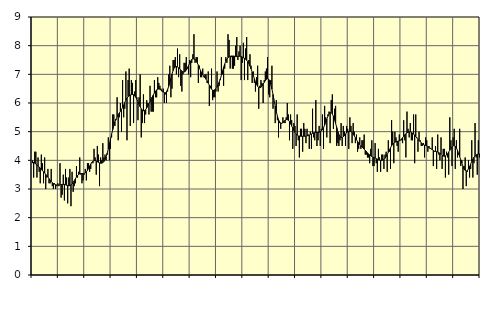
| Category | Piggar | Series 1 |
|---|---|---|
| nan | 4 | 3.91 |
| 87.0 | 3.4 | 3.93 |
| 87.0 | 4.3 | 3.9 |
| 87.0 | 4.3 | 3.87 |
| 87.0 | 3.4 | 3.84 |
| 87.0 | 4.1 | 3.8 |
| 87.0 | 3.6 | 3.77 |
| 87.0 | 3.2 | 3.73 |
| 87.0 | 4.2 | 3.68 |
| 87.0 | 3.9 | 3.64 |
| 87.0 | 3.2 | 3.6 |
| 87.0 | 4.1 | 3.56 |
| nan | 3 | 3.51 |
| 88.0 | 3.4 | 3.47 |
| 88.0 | 3.7 | 3.42 |
| 88.0 | 3.2 | 3.36 |
| 88.0 | 3.2 | 3.31 |
| 88.0 | 3.7 | 3.26 |
| 88.0 | 3.1 | 3.22 |
| 88.0 | 3 | 3.19 |
| 88.0 | 3.2 | 3.17 |
| 88.0 | 3 | 3.15 |
| 88.0 | 3.1 | 3.14 |
| 88.0 | 3.2 | 3.14 |
| nan | 3.1 | 3.14 |
| 89.0 | 3.9 | 3.15 |
| 89.0 | 2.7 | 3.15 |
| 89.0 | 2.8 | 3.16 |
| 89.0 | 3.5 | 3.16 |
| 89.0 | 2.6 | 3.16 |
| 89.0 | 3.7 | 3.15 |
| 89.0 | 3.4 | 3.13 |
| 89.0 | 2.5 | 3.12 |
| 89.0 | 3.4 | 3.11 |
| 89.0 | 3.7 | 3.12 |
| 89.0 | 2.4 | 3.14 |
| nan | 3.6 | 3.18 |
| 90.0 | 2.9 | 3.23 |
| 90.0 | 3.1 | 3.29 |
| 90.0 | 3.2 | 3.35 |
| 90.0 | 3.8 | 3.42 |
| 90.0 | 3.4 | 3.47 |
| 90.0 | 3.6 | 3.51 |
| 90.0 | 4.1 | 3.53 |
| 90.0 | 3.5 | 3.54 |
| 90.0 | 3.2 | 3.54 |
| 90.0 | 3.3 | 3.54 |
| 90.0 | 3.5 | 3.54 |
| nan | 3.7 | 3.56 |
| 91.0 | 3.3 | 3.6 |
| 91.0 | 3.9 | 3.65 |
| 91.0 | 3.9 | 3.72 |
| 91.0 | 3.6 | 3.8 |
| 91.0 | 3.7 | 3.87 |
| 91.0 | 3.9 | 3.93 |
| 91.0 | 3.9 | 3.97 |
| 91.0 | 4.4 | 3.99 |
| 91.0 | 4.1 | 3.99 |
| 91.0 | 3.5 | 3.97 |
| 91.0 | 4.5 | 3.95 |
| nan | 4.2 | 3.93 |
| 92.0 | 3.1 | 3.91 |
| 92.0 | 4.1 | 3.9 |
| 92.0 | 4 | 3.9 |
| 92.0 | 4.6 | 3.92 |
| 92.0 | 4.1 | 3.96 |
| 92.0 | 4.2 | 4.03 |
| 92.0 | 4 | 4.12 |
| 92.0 | 4.2 | 4.25 |
| 92.0 | 4.8 | 4.4 |
| 92.0 | 4 | 4.57 |
| 92.0 | 4.4 | 4.74 |
| nan | 4.8 | 4.91 |
| 93.0 | 5.6 | 5.07 |
| 93.0 | 5.6 | 5.21 |
| 93.0 | 5.2 | 5.34 |
| 93.0 | 5.4 | 5.44 |
| 93.0 | 6.2 | 5.52 |
| 93.0 | 4.7 | 5.59 |
| 93.0 | 5.5 | 5.65 |
| 93.0 | 6 | 5.71 |
| 93.0 | 5 | 5.77 |
| 93.0 | 6.8 | 5.85 |
| 93.0 | 5.5 | 5.93 |
| nan | 5.8 | 6.02 |
| 94.0 | 7.1 | 6.1 |
| 94.0 | 4.7 | 6.17 |
| 94.0 | 6.8 | 6.22 |
| 94.0 | 7.2 | 6.25 |
| 94.0 | 5.2 | 6.28 |
| 94.0 | 6.8 | 6.29 |
| 94.0 | 6.7 | 6.3 |
| 94.0 | 5.3 | 6.29 |
| 94.0 | 6.4 | 6.25 |
| 94.0 | 6.8 | 6.2 |
| 94.0 | 6.2 | 6.13 |
| nan | 5.4 | 6.05 |
| 95.0 | 6.2 | 5.96 |
| 95.0 | 7 | 5.87 |
| 95.0 | 4.8 | 5.8 |
| 95.0 | 5.3 | 5.75 |
| 95.0 | 6.3 | 5.73 |
| 95.0 | 5.3 | 5.74 |
| 95.0 | 5.6 | 5.77 |
| 95.0 | 6.1 | 5.83 |
| 95.0 | 6 | 5.9 |
| 95.0 | 5.6 | 5.98 |
| 95.0 | 6.6 | 6.05 |
| nan | 5.7 | 6.13 |
| 96.0 | 5.7 | 6.21 |
| 96.0 | 5.7 | 6.28 |
| 96.0 | 6.8 | 6.35 |
| 96.0 | 6.2 | 6.41 |
| 96.0 | 6.2 | 6.46 |
| 96.0 | 6.9 | 6.48 |
| 96.0 | 6.7 | 6.49 |
| 96.0 | 6.6 | 6.48 |
| 96.0 | 6.5 | 6.45 |
| 96.0 | 6.4 | 6.42 |
| 96.0 | 6.5 | 6.38 |
| nan | 6 | 6.36 |
| 97.0 | 6.3 | 6.36 |
| 97.0 | 6 | 6.4 |
| 97.0 | 6.4 | 6.47 |
| 97.0 | 7 | 6.58 |
| 97.0 | 7.3 | 6.71 |
| 97.0 | 6.2 | 6.86 |
| 97.0 | 6.5 | 7.01 |
| 97.0 | 7.5 | 7.13 |
| 97.0 | 7.5 | 7.22 |
| 97.0 | 7.6 | 7.26 |
| 97.0 | 7 | 7.27 |
| nan | 7.9 | 7.26 |
| 98.0 | 6.9 | 7.23 |
| 98.0 | 7.7 | 7.19 |
| 98.0 | 6.6 | 7.15 |
| 98.0 | 6.4 | 7.11 |
| 98.0 | 7 | 7.08 |
| 98.0 | 7.4 | 7.08 |
| 98.0 | 7.4 | 7.1 |
| 98.0 | 7.6 | 7.15 |
| 98.0 | 7.2 | 7.22 |
| 98.0 | 7 | 7.3 |
| 98.0 | 7.5 | 7.39 |
| nan | 6.9 | 7.46 |
| 99.0 | 7.4 | 7.52 |
| 99.0 | 7.7 | 7.54 |
| 99.0 | 8.4 | 7.54 |
| 99.0 | 7.4 | 7.52 |
| 99.0 | 7.6 | 7.47 |
| 99.0 | 7.6 | 7.4 |
| 99.0 | 6.7 | 7.32 |
| 99.0 | 7.3 | 7.22 |
| 99.0 | 6.9 | 7.13 |
| 99.0 | 6.9 | 7.05 |
| 99.0 | 7.2 | 6.99 |
| nan | 6.9 | 6.93 |
| 0.0 | 7 | 6.88 |
| 0.0 | 7 | 6.83 |
| 0.0 | 6.7 | 6.77 |
| 0.0 | 7.1 | 6.69 |
| 0.0 | 5.9 | 6.62 |
| 0.0 | 6.6 | 6.54 |
| 0.0 | 7.2 | 6.48 |
| 0.0 | 6.1 | 6.45 |
| 0.0 | 6.2 | 6.44 |
| 0.0 | 6.2 | 6.46 |
| 0.0 | 6.4 | 6.5 |
| nan | 7.1 | 6.56 |
| 1.0 | 6.4 | 6.64 |
| 1.0 | 6.6 | 6.73 |
| 1.0 | 6.8 | 6.84 |
| 1.0 | 7.6 | 6.97 |
| 1.0 | 7 | 7.11 |
| 1.0 | 6.6 | 7.24 |
| 1.0 | 7.2 | 7.36 |
| 1.0 | 7.6 | 7.46 |
| 1.0 | 7.4 | 7.53 |
| 1.0 | 8.4 | 7.58 |
| 1.0 | 8.2 | 7.61 |
| nan | 7.2 | 7.63 |
| 2.0 | 7.6 | 7.64 |
| 2.0 | 7.2 | 7.64 |
| 2.0 | 7.2 | 7.64 |
| 2.0 | 7.3 | 7.63 |
| 2.0 | 8 | 7.62 |
| 2.0 | 8.3 | 7.62 |
| 2.0 | 7.5 | 7.63 |
| 2.0 | 7.8 | 7.63 |
| 2.0 | 8 | 7.63 |
| 2.0 | 6.8 | 7.62 |
| 2.0 | 7.4 | 7.6 |
| nan | 8.1 | 7.58 |
| 3.0 | 6.8 | 7.56 |
| 3.0 | 7.9 | 7.53 |
| 3.0 | 8.3 | 7.49 |
| 3.0 | 6.8 | 7.45 |
| 3.0 | 7.5 | 7.38 |
| 3.0 | 7.7 | 7.29 |
| 3.0 | 7.3 | 7.19 |
| 3.0 | 6.7 | 7.08 |
| 3.0 | 7.1 | 6.96 |
| 3.0 | 6.7 | 6.85 |
| 3.0 | 6.4 | 6.74 |
| nan | 6.9 | 6.65 |
| 4.0 | 7.3 | 6.58 |
| 4.0 | 5.8 | 6.54 |
| 4.0 | 6.6 | 6.53 |
| 4.0 | 6.8 | 6.55 |
| 4.0 | 6.7 | 6.6 |
| 4.0 | 6 | 6.66 |
| 4.0 | 6.8 | 6.72 |
| 4.0 | 7.1 | 6.78 |
| 4.0 | 7.2 | 6.83 |
| 4.0 | 7.6 | 6.85 |
| 4.0 | 6.3 | 6.83 |
| nan | 6.2 | 6.77 |
| 5.0 | 6.8 | 6.65 |
| 5.0 | 7.3 | 6.49 |
| 5.0 | 5.8 | 6.3 |
| 5.0 | 6.1 | 6.1 |
| 5.0 | 5.3 | 5.89 |
| 5.0 | 6.1 | 5.7 |
| 5.0 | 5.4 | 5.54 |
| 5.0 | 4.8 | 5.42 |
| 5.0 | 5.3 | 5.34 |
| 5.0 | 5.1 | 5.3 |
| 5.0 | 5.3 | 5.29 |
| nan | 5.5 | 5.32 |
| 6.0 | 5.3 | 5.36 |
| 6.0 | 5.3 | 5.4 |
| 6.0 | 5.5 | 5.42 |
| 6.0 | 6 | 5.42 |
| 6.0 | 5.6 | 5.4 |
| 6.0 | 4.7 | 5.35 |
| 6.0 | 5.6 | 5.28 |
| 6.0 | 5.4 | 5.2 |
| 6.0 | 4.4 | 5.12 |
| 6.0 | 5.3 | 5.04 |
| 6.0 | 5.2 | 4.97 |
| nan | 4.5 | 4.92 |
| 7.0 | 5.6 | 4.88 |
| 7.0 | 4.7 | 4.85 |
| 7.0 | 4.1 | 4.85 |
| 7.0 | 5.1 | 4.84 |
| 7.0 | 5.1 | 4.84 |
| 7.0 | 4.3 | 4.84 |
| 7.0 | 5.3 | 4.84 |
| 7.0 | 5.1 | 4.84 |
| 7.0 | 4.6 | 4.84 |
| 7.0 | 5.1 | 4.85 |
| 7.0 | 4.9 | 4.87 |
| nan | 4.4 | 4.88 |
| 8.0 | 5 | 4.9 |
| 8.0 | 4.4 | 4.92 |
| 8.0 | 5.8 | 4.94 |
| 8.0 | 4.8 | 4.96 |
| 8.0 | 4.7 | 4.97 |
| 8.0 | 6.1 | 4.97 |
| 8.0 | 4.5 | 4.97 |
| 8.0 | 4.7 | 4.98 |
| 8.0 | 5.2 | 4.98 |
| 8.0 | 4.5 | 5 |
| 8.0 | 5.1 | 5.02 |
| nan | 5.6 | 5.07 |
| 9.0 | 4.4 | 5.14 |
| 9.0 | 5.9 | 5.23 |
| 9.0 | 5.5 | 5.33 |
| 9.0 | 4.8 | 5.44 |
| 9.0 | 5.6 | 5.54 |
| 9.0 | 5.7 | 5.62 |
| 9.0 | 4.6 | 5.67 |
| 9.0 | 6.1 | 5.67 |
| 9.0 | 6.3 | 5.62 |
| 9.0 | 5.1 | 5.54 |
| 9.0 | 5.8 | 5.42 |
| nan | 5.9 | 5.29 |
| 10.0 | 4.5 | 5.15 |
| 10.0 | 4.6 | 5.01 |
| 10.0 | 4.5 | 4.9 |
| 10.0 | 4.7 | 4.83 |
| 10.0 | 5.3 | 4.79 |
| 10.0 | 4.5 | 4.79 |
| 10.0 | 5.2 | 4.82 |
| 10.0 | 5 | 4.86 |
| 10.0 | 4.5 | 4.92 |
| 10.0 | 5.2 | 4.96 |
| 10.0 | 5.1 | 5 |
| nan | 4.4 | 5.01 |
| 11.0 | 5.5 | 5.01 |
| 11.0 | 5.2 | 5 |
| 11.0 | 4.6 | 4.97 |
| 11.0 | 5.3 | 4.92 |
| 11.0 | 5 | 4.86 |
| 11.0 | 4.6 | 4.79 |
| 11.0 | 4.9 | 4.72 |
| 11.0 | 4.3 | 4.66 |
| 11.0 | 4.4 | 4.61 |
| 11.0 | 4.8 | 4.55 |
| 11.0 | 4.4 | 4.51 |
| nan | 4.7 | 4.47 |
| 12.0 | 4.7 | 4.43 |
| 12.0 | 4.9 | 4.39 |
| 12.0 | 4.2 | 4.35 |
| 12.0 | 4.2 | 4.31 |
| 12.0 | 4.1 | 4.26 |
| 12.0 | 4.1 | 4.22 |
| 12.0 | 3.9 | 4.19 |
| 12.0 | 4.4 | 4.16 |
| 12.0 | 4.7 | 4.13 |
| 12.0 | 3.8 | 4.11 |
| 12.0 | 3.8 | 4.09 |
| nan | 4.6 | 4.08 |
| 13.0 | 3.9 | 4.06 |
| 13.0 | 3.6 | 4.04 |
| 13.0 | 4.4 | 4.02 |
| 13.0 | 4.1 | 4.01 |
| 13.0 | 3.6 | 4 |
| 13.0 | 4.2 | 4 |
| 13.0 | 4.2 | 4.01 |
| 13.0 | 3.7 | 4.04 |
| 13.0 | 4.2 | 4.07 |
| 13.0 | 4.3 | 4.13 |
| 13.0 | 3.6 | 4.2 |
| nan | 4.7 | 4.28 |
| 14.0 | 4.3 | 4.36 |
| 14.0 | 3.7 | 4.44 |
| 14.0 | 5.4 | 4.51 |
| 14.0 | 5 | 4.56 |
| 14.0 | 3.9 | 4.6 |
| 14.0 | 5 | 4.63 |
| 14.0 | 4.8 | 4.65 |
| 14.0 | 4.5 | 4.66 |
| 14.0 | 4.3 | 4.67 |
| 14.0 | 4.9 | 4.68 |
| 14.0 | 4.7 | 4.71 |
| nan | 4.7 | 4.74 |
| 15.0 | 4.6 | 4.79 |
| 15.0 | 5.4 | 4.84 |
| 15.0 | 4.7 | 4.89 |
| 15.0 | 4.1 | 4.93 |
| 15.0 | 5.7 | 4.96 |
| 15.0 | 5.1 | 4.98 |
| 15.0 | 4.8 | 4.99 |
| 15.0 | 5.3 | 4.99 |
| 15.0 | 4.7 | 4.97 |
| 15.0 | 4.7 | 4.95 |
| 15.0 | 5.6 | 4.92 |
| nan | 3.9 | 4.88 |
| 16.0 | 5.6 | 4.83 |
| 16.0 | 4.8 | 4.78 |
| 16.0 | 4.3 | 4.73 |
| 16.0 | 5 | 4.69 |
| 16.0 | 4.7 | 4.65 |
| 16.0 | 4.5 | 4.61 |
| 16.0 | 4.5 | 4.58 |
| 16.0 | 4.6 | 4.55 |
| 16.0 | 4.1 | 4.53 |
| 16.0 | 4.8 | 4.52 |
| 16.0 | 4.7 | 4.5 |
| nan | 4.3 | 4.48 |
| 17.0 | 4.5 | 4.45 |
| 17.0 | 4.4 | 4.43 |
| 17.0 | 4.4 | 4.4 |
| 17.0 | 4.8 | 4.37 |
| 17.0 | 3.8 | 4.34 |
| 17.0 | 4.3 | 4.32 |
| 17.0 | 4.5 | 4.31 |
| 17.0 | 3.7 | 4.3 |
| 17.0 | 4.9 | 4.29 |
| 17.0 | 4.2 | 4.27 |
| 17.0 | 4 | 4.24 |
| nan | 4.8 | 4.21 |
| 18.0 | 3.7 | 4.17 |
| 18.0 | 4.4 | 4.15 |
| 18.0 | 4.4 | 4.14 |
| 18.0 | 3.4 | 4.15 |
| 18.0 | 4.3 | 4.19 |
| 18.0 | 4.1 | 4.23 |
| 18.0 | 3.5 | 4.29 |
| 18.0 | 5.5 | 4.35 |
| 18.0 | 4.7 | 4.42 |
| 18.0 | 3.8 | 4.47 |
| 18.0 | 4.8 | 4.51 |
| nan | 5.1 | 4.51 |
| 19.0 | 3.7 | 4.49 |
| 19.0 | 4.7 | 4.43 |
| 19.0 | 4.1 | 4.35 |
| 19.0 | 4.2 | 4.24 |
| 19.0 | 5.1 | 4.13 |
| 19.0 | 3.8 | 4.01 |
| 19.0 | 4 | 3.9 |
| 19.0 | 3 | 3.79 |
| 19.0 | 3.8 | 3.7 |
| 19.0 | 4.1 | 3.65 |
| 19.0 | 3.1 | 3.63 |
| nan | 3.6 | 3.64 |
| 20.0 | 4 | 3.7 |
| 20.0 | 3.4 | 3.78 |
| 20.0 | 3.7 | 3.87 |
| 20.0 | 4.7 | 3.96 |
| 20.0 | 3.4 | 4.04 |
| 20.0 | 3.9 | 4.11 |
| 20.0 | 5.3 | 4.15 |
| 20.0 | 4.1 | 4.19 |
| 20.0 | 3.5 | 4.21 |
| 20.0 | 4.7 | 4.22 |
| 20.0 | 4.1 | 4.23 |